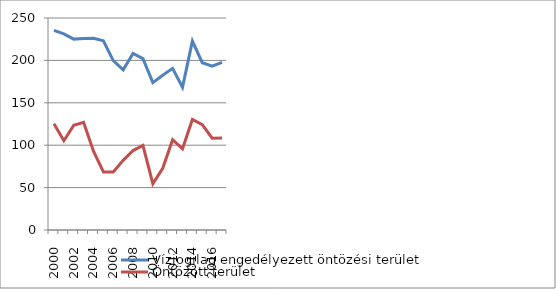
| Category | Vízjogilag engedélyezett öntözési terület | Öntözött terület |
|---|---|---|
| 2000.0 | 235.5 | 125.3 |
| 2001.0 | 231.2 | 105.3 |
| 2002.0 | 225.1 | 123.4 |
| 2003.0 | 225.8 | 126.9 |
| 2004.0 | 226 | 93 |
| 2005.0 | 223.1 | 68.4 |
| 2006.0 | 199.7 | 68.4 |
| 2007.0 | 188.8 | 82.1 |
| 2008.0 | 208.1 | 93.7 |
| 2009.0 | 202.1 | 99.7 |
| 2010.0 | 173.8 | 54.6 |
| 2011.0 | 182.5 | 72.7 |
| 2012.0 | 190.6 | 106.5 |
| 2013.0 | 168.3 | 95.8 |
| 2014.0 | 222.8 | 130.4 |
| 2015.0 | 197.3 | 124.3 |
| 2016.0 | 193.219 | 108.233 |
| 2017.0 | 197.758 | 108.595 |